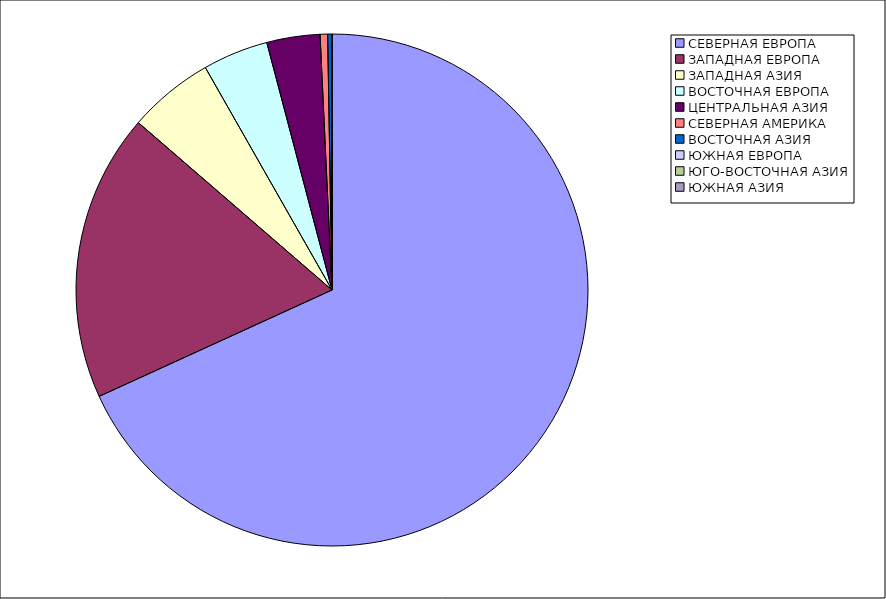
| Category | Оборот |
|---|---|
| СЕВЕРНАЯ ЕВРОПА | 68.178 |
| ЗАПАДНАЯ ЕВРОПА | 18.164 |
| ЗАПАДНАЯ АЗИЯ | 5.42 |
| ВОСТОЧНАЯ ЕВРОПА | 4.136 |
| ЦЕНТРАЛЬНАЯ АЗИЯ | 3.358 |
| СЕВЕРНАЯ АМЕРИКА | 0.471 |
| ВОСТОЧНАЯ АЗИЯ | 0.242 |
| ЮЖНАЯ ЕВРОПА | 0.029 |
| ЮГО-ВОСТОЧНАЯ АЗИЯ | 0.001 |
| ЮЖНАЯ АЗИЯ | 0 |